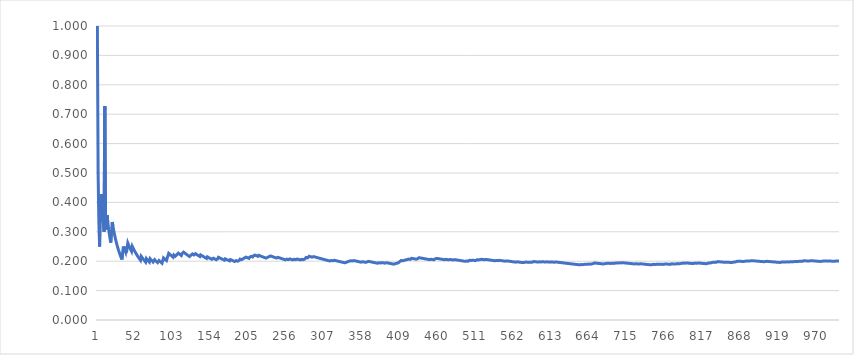
| Category | Series 0 |
|---|---|
| 0 | 1 |
| 1 | 0.5 |
| 2 | 0.333 |
| 3 | 0.25 |
| 4 | 0.4 |
| 5 | 0.333 |
| 6 | 0.429 |
| 7 | 0.375 |
| 8 | 0.333 |
| 9 | 0.3 |
| 10 | 0.727 |
| 11 | 0.333 |
| 12 | 0.308 |
| 13 | 0.357 |
| 14 | 0.333 |
| 15 | 0.312 |
| 16 | 0.294 |
| 17 | 0.278 |
| 18 | 0.263 |
| 19 | 0.3 |
| 20 | 0.333 |
| 21 | 0.318 |
| 22 | 0.304 |
| 23 | 0.292 |
| 24 | 0.28 |
| 25 | 0.269 |
| 26 | 0.259 |
| 27 | 0.25 |
| 28 | 0.241 |
| 29 | 0.233 |
| 30 | 0.226 |
| 31 | 0.219 |
| 32 | 0.212 |
| 33 | 0.206 |
| 34 | 0.229 |
| 35 | 0.25 |
| 36 | 0.243 |
| 37 | 0.237 |
| 38 | 0.231 |
| 39 | 0.25 |
| 40 | 0.244 |
| 41 | 0.262 |
| 42 | 0.256 |
| 43 | 0.25 |
| 44 | 0.244 |
| 45 | 0.239 |
| 46 | 0.234 |
| 47 | 0.25 |
| 48 | 0.245 |
| 49 | 0.24 |
| 50 | 0.235 |
| 51 | 0.231 |
| 52 | 0.226 |
| 53 | 0.222 |
| 54 | 0.218 |
| 55 | 0.214 |
| 56 | 0.211 |
| 57 | 0.207 |
| 58 | 0.203 |
| 59 | 0.217 |
| 60 | 0.213 |
| 61 | 0.21 |
| 62 | 0.206 |
| 63 | 0.203 |
| 64 | 0.2 |
| 65 | 0.197 |
| 66 | 0.209 |
| 67 | 0.206 |
| 68 | 0.203 |
| 69 | 0.2 |
| 70 | 0.197 |
| 71 | 0.208 |
| 72 | 0.205 |
| 73 | 0.203 |
| 74 | 0.2 |
| 75 | 0.197 |
| 76 | 0.195 |
| 77 | 0.205 |
| 78 | 0.203 |
| 79 | 0.2 |
| 80 | 0.198 |
| 81 | 0.195 |
| 82 | 0.193 |
| 83 | 0.202 |
| 84 | 0.2 |
| 85 | 0.198 |
| 86 | 0.195 |
| 87 | 0.193 |
| 88 | 0.202 |
| 89 | 0.211 |
| 90 | 0.209 |
| 91 | 0.207 |
| 92 | 0.204 |
| 93 | 0.202 |
| 94 | 0.211 |
| 95 | 0.219 |
| 96 | 0.227 |
| 97 | 0.224 |
| 98 | 0.222 |
| 99 | 0.22 |
| 100 | 0.218 |
| 101 | 0.216 |
| 102 | 0.214 |
| 103 | 0.221 |
| 104 | 0.219 |
| 105 | 0.217 |
| 106 | 0.215 |
| 107 | 0.222 |
| 108 | 0.22 |
| 109 | 0.227 |
| 110 | 0.225 |
| 111 | 0.223 |
| 112 | 0.221 |
| 113 | 0.219 |
| 114 | 0.226 |
| 115 | 0.224 |
| 116 | 0.231 |
| 117 | 0.229 |
| 118 | 0.227 |
| 119 | 0.225 |
| 120 | 0.223 |
| 121 | 0.221 |
| 122 | 0.22 |
| 123 | 0.218 |
| 124 | 0.216 |
| 125 | 0.214 |
| 126 | 0.22 |
| 127 | 0.219 |
| 128 | 0.225 |
| 129 | 0.223 |
| 130 | 0.221 |
| 131 | 0.22 |
| 132 | 0.226 |
| 133 | 0.224 |
| 134 | 0.222 |
| 135 | 0.221 |
| 136 | 0.219 |
| 137 | 0.217 |
| 138 | 0.216 |
| 139 | 0.221 |
| 140 | 0.22 |
| 141 | 0.218 |
| 142 | 0.217 |
| 143 | 0.215 |
| 144 | 0.214 |
| 145 | 0.212 |
| 146 | 0.211 |
| 147 | 0.209 |
| 148 | 0.215 |
| 149 | 0.213 |
| 150 | 0.212 |
| 151 | 0.211 |
| 152 | 0.209 |
| 153 | 0.208 |
| 154 | 0.206 |
| 155 | 0.205 |
| 156 | 0.21 |
| 157 | 0.209 |
| 158 | 0.208 |
| 159 | 0.206 |
| 160 | 0.205 |
| 161 | 0.204 |
| 162 | 0.209 |
| 163 | 0.213 |
| 164 | 0.212 |
| 165 | 0.211 |
| 166 | 0.21 |
| 167 | 0.208 |
| 168 | 0.207 |
| 169 | 0.206 |
| 170 | 0.205 |
| 171 | 0.203 |
| 172 | 0.208 |
| 173 | 0.207 |
| 174 | 0.206 |
| 175 | 0.205 |
| 176 | 0.203 |
| 177 | 0.202 |
| 178 | 0.201 |
| 179 | 0.206 |
| 180 | 0.204 |
| 181 | 0.203 |
| 182 | 0.202 |
| 183 | 0.201 |
| 184 | 0.2 |
| 185 | 0.199 |
| 186 | 0.198 |
| 187 | 0.202 |
| 188 | 0.201 |
| 189 | 0.2 |
| 190 | 0.199 |
| 191 | 0.203 |
| 192 | 0.207 |
| 193 | 0.206 |
| 194 | 0.205 |
| 195 | 0.204 |
| 196 | 0.208 |
| 197 | 0.207 |
| 198 | 0.211 |
| 199 | 0.21 |
| 200 | 0.214 |
| 201 | 0.213 |
| 202 | 0.212 |
| 203 | 0.211 |
| 204 | 0.21 |
| 205 | 0.214 |
| 206 | 0.213 |
| 207 | 0.216 |
| 208 | 0.215 |
| 209 | 0.214 |
| 210 | 0.218 |
| 211 | 0.217 |
| 212 | 0.221 |
| 213 | 0.22 |
| 214 | 0.219 |
| 215 | 0.218 |
| 216 | 0.217 |
| 217 | 0.22 |
| 218 | 0.219 |
| 219 | 0.218 |
| 220 | 0.217 |
| 221 | 0.216 |
| 222 | 0.215 |
| 223 | 0.214 |
| 224 | 0.213 |
| 225 | 0.212 |
| 226 | 0.211 |
| 227 | 0.211 |
| 228 | 0.21 |
| 229 | 0.213 |
| 230 | 0.212 |
| 231 | 0.216 |
| 232 | 0.215 |
| 233 | 0.218 |
| 234 | 0.217 |
| 235 | 0.216 |
| 236 | 0.215 |
| 237 | 0.214 |
| 238 | 0.213 |
| 239 | 0.212 |
| 240 | 0.212 |
| 241 | 0.211 |
| 242 | 0.214 |
| 243 | 0.213 |
| 244 | 0.212 |
| 245 | 0.211 |
| 246 | 0.211 |
| 247 | 0.21 |
| 248 | 0.209 |
| 249 | 0.208 |
| 250 | 0.207 |
| 251 | 0.206 |
| 252 | 0.206 |
| 253 | 0.205 |
| 254 | 0.204 |
| 255 | 0.207 |
| 256 | 0.206 |
| 257 | 0.205 |
| 258 | 0.208 |
| 259 | 0.208 |
| 260 | 0.207 |
| 261 | 0.206 |
| 262 | 0.205 |
| 263 | 0.205 |
| 264 | 0.204 |
| 265 | 0.207 |
| 266 | 0.206 |
| 267 | 0.205 |
| 268 | 0.208 |
| 269 | 0.207 |
| 270 | 0.207 |
| 271 | 0.206 |
| 272 | 0.205 |
| 273 | 0.204 |
| 274 | 0.207 |
| 275 | 0.207 |
| 276 | 0.206 |
| 277 | 0.205 |
| 278 | 0.204 |
| 279 | 0.207 |
| 280 | 0.21 |
| 281 | 0.213 |
| 282 | 0.212 |
| 283 | 0.211 |
| 284 | 0.214 |
| 285 | 0.217 |
| 286 | 0.216 |
| 287 | 0.215 |
| 288 | 0.215 |
| 289 | 0.214 |
| 290 | 0.213 |
| 291 | 0.216 |
| 292 | 0.215 |
| 293 | 0.214 |
| 294 | 0.214 |
| 295 | 0.213 |
| 296 | 0.212 |
| 297 | 0.211 |
| 298 | 0.211 |
| 299 | 0.21 |
| 300 | 0.209 |
| 301 | 0.209 |
| 302 | 0.208 |
| 303 | 0.207 |
| 304 | 0.207 |
| 305 | 0.206 |
| 306 | 0.205 |
| 307 | 0.205 |
| 308 | 0.204 |
| 309 | 0.203 |
| 310 | 0.203 |
| 311 | 0.202 |
| 312 | 0.201 |
| 313 | 0.201 |
| 314 | 0.2 |
| 315 | 0.203 |
| 316 | 0.202 |
| 317 | 0.201 |
| 318 | 0.204 |
| 319 | 0.203 |
| 320 | 0.202 |
| 321 | 0.202 |
| 322 | 0.201 |
| 323 | 0.201 |
| 324 | 0.2 |
| 325 | 0.199 |
| 326 | 0.199 |
| 327 | 0.198 |
| 328 | 0.198 |
| 329 | 0.197 |
| 330 | 0.196 |
| 331 | 0.196 |
| 332 | 0.195 |
| 333 | 0.195 |
| 334 | 0.197 |
| 335 | 0.196 |
| 336 | 0.199 |
| 337 | 0.198 |
| 338 | 0.201 |
| 339 | 0.2 |
| 340 | 0.199 |
| 341 | 0.202 |
| 342 | 0.201 |
| 343 | 0.201 |
| 344 | 0.203 |
| 345 | 0.202 |
| 346 | 0.202 |
| 347 | 0.201 |
| 348 | 0.201 |
| 349 | 0.2 |
| 350 | 0.199 |
| 351 | 0.199 |
| 352 | 0.198 |
| 353 | 0.198 |
| 354 | 0.197 |
| 355 | 0.197 |
| 356 | 0.199 |
| 357 | 0.198 |
| 358 | 0.198 |
| 359 | 0.197 |
| 360 | 0.197 |
| 361 | 0.196 |
| 362 | 0.198 |
| 363 | 0.198 |
| 364 | 0.197 |
| 365 | 0.199 |
| 366 | 0.199 |
| 367 | 0.198 |
| 368 | 0.198 |
| 369 | 0.197 |
| 370 | 0.197 |
| 371 | 0.196 |
| 372 | 0.196 |
| 373 | 0.195 |
| 374 | 0.195 |
| 375 | 0.194 |
| 376 | 0.194 |
| 377 | 0.193 |
| 378 | 0.193 |
| 379 | 0.195 |
| 380 | 0.194 |
| 381 | 0.194 |
| 382 | 0.196 |
| 383 | 0.195 |
| 384 | 0.195 |
| 385 | 0.194 |
| 386 | 0.194 |
| 387 | 0.193 |
| 388 | 0.193 |
| 389 | 0.195 |
| 390 | 0.194 |
| 391 | 0.194 |
| 392 | 0.193 |
| 393 | 0.193 |
| 394 | 0.192 |
| 395 | 0.192 |
| 396 | 0.191 |
| 397 | 0.191 |
| 398 | 0.19 |
| 399 | 0.19 |
| 400 | 0.192 |
| 401 | 0.192 |
| 402 | 0.191 |
| 403 | 0.193 |
| 404 | 0.193 |
| 405 | 0.195 |
| 406 | 0.197 |
| 407 | 0.199 |
| 408 | 0.2 |
| 409 | 0.202 |
| 410 | 0.202 |
| 411 | 0.201 |
| 412 | 0.201 |
| 413 | 0.203 |
| 414 | 0.202 |
| 415 | 0.204 |
| 416 | 0.206 |
| 417 | 0.206 |
| 418 | 0.205 |
| 419 | 0.207 |
| 420 | 0.207 |
| 421 | 0.206 |
| 422 | 0.208 |
| 423 | 0.21 |
| 424 | 0.209 |
| 425 | 0.209 |
| 426 | 0.208 |
| 427 | 0.208 |
| 428 | 0.207 |
| 429 | 0.207 |
| 430 | 0.206 |
| 431 | 0.208 |
| 432 | 0.21 |
| 433 | 0.212 |
| 434 | 0.211 |
| 435 | 0.211 |
| 436 | 0.211 |
| 437 | 0.21 |
| 438 | 0.21 |
| 439 | 0.209 |
| 440 | 0.209 |
| 441 | 0.208 |
| 442 | 0.208 |
| 443 | 0.207 |
| 444 | 0.207 |
| 445 | 0.206 |
| 446 | 0.206 |
| 447 | 0.205 |
| 448 | 0.205 |
| 449 | 0.207 |
| 450 | 0.206 |
| 451 | 0.206 |
| 452 | 0.205 |
| 453 | 0.205 |
| 454 | 0.207 |
| 455 | 0.208 |
| 456 | 0.21 |
| 457 | 0.21 |
| 458 | 0.209 |
| 459 | 0.209 |
| 460 | 0.208 |
| 461 | 0.208 |
| 462 | 0.207 |
| 463 | 0.207 |
| 464 | 0.206 |
| 465 | 0.206 |
| 466 | 0.206 |
| 467 | 0.205 |
| 468 | 0.207 |
| 469 | 0.206 |
| 470 | 0.206 |
| 471 | 0.206 |
| 472 | 0.205 |
| 473 | 0.205 |
| 474 | 0.204 |
| 475 | 0.206 |
| 476 | 0.205 |
| 477 | 0.205 |
| 478 | 0.205 |
| 479 | 0.204 |
| 480 | 0.204 |
| 481 | 0.205 |
| 482 | 0.205 |
| 483 | 0.205 |
| 484 | 0.204 |
| 485 | 0.204 |
| 486 | 0.203 |
| 487 | 0.203 |
| 488 | 0.202 |
| 489 | 0.202 |
| 490 | 0.202 |
| 491 | 0.201 |
| 492 | 0.201 |
| 493 | 0.2 |
| 494 | 0.2 |
| 495 | 0.2 |
| 496 | 0.201 |
| 497 | 0.201 |
| 498 | 0.2 |
| 499 | 0.2 |
| 500 | 0.202 |
| 501 | 0.203 |
| 502 | 0.203 |
| 503 | 0.202 |
| 504 | 0.202 |
| 505 | 0.204 |
| 506 | 0.203 |
| 507 | 0.203 |
| 508 | 0.202 |
| 509 | 0.202 |
| 510 | 0.204 |
| 511 | 0.205 |
| 512 | 0.205 |
| 513 | 0.204 |
| 514 | 0.206 |
| 515 | 0.205 |
| 516 | 0.207 |
| 517 | 0.207 |
| 518 | 0.206 |
| 519 | 0.206 |
| 520 | 0.205 |
| 521 | 0.205 |
| 522 | 0.205 |
| 523 | 0.206 |
| 524 | 0.206 |
| 525 | 0.205 |
| 526 | 0.205 |
| 527 | 0.205 |
| 528 | 0.204 |
| 529 | 0.204 |
| 530 | 0.203 |
| 531 | 0.203 |
| 532 | 0.203 |
| 533 | 0.202 |
| 534 | 0.202 |
| 535 | 0.201 |
| 536 | 0.201 |
| 537 | 0.203 |
| 538 | 0.202 |
| 539 | 0.202 |
| 540 | 0.203 |
| 541 | 0.203 |
| 542 | 0.203 |
| 543 | 0.202 |
| 544 | 0.202 |
| 545 | 0.201 |
| 546 | 0.201 |
| 547 | 0.201 |
| 548 | 0.2 |
| 549 | 0.2 |
| 550 | 0.2 |
| 551 | 0.201 |
| 552 | 0.201 |
| 553 | 0.2 |
| 554 | 0.2 |
| 555 | 0.2 |
| 556 | 0.199 |
| 557 | 0.199 |
| 558 | 0.199 |
| 559 | 0.198 |
| 560 | 0.198 |
| 561 | 0.198 |
| 562 | 0.197 |
| 563 | 0.197 |
| 564 | 0.196 |
| 565 | 0.198 |
| 566 | 0.198 |
| 567 | 0.197 |
| 568 | 0.197 |
| 569 | 0.196 |
| 570 | 0.196 |
| 571 | 0.196 |
| 572 | 0.195 |
| 573 | 0.195 |
| 574 | 0.195 |
| 575 | 0.196 |
| 576 | 0.198 |
| 577 | 0.197 |
| 578 | 0.197 |
| 579 | 0.197 |
| 580 | 0.196 |
| 581 | 0.196 |
| 582 | 0.196 |
| 583 | 0.197 |
| 584 | 0.197 |
| 585 | 0.196 |
| 586 | 0.198 |
| 587 | 0.199 |
| 588 | 0.199 |
| 589 | 0.198 |
| 590 | 0.198 |
| 591 | 0.198 |
| 592 | 0.197 |
| 593 | 0.197 |
| 594 | 0.197 |
| 595 | 0.198 |
| 596 | 0.198 |
| 597 | 0.197 |
| 598 | 0.199 |
| 599 | 0.198 |
| 600 | 0.198 |
| 601 | 0.198 |
| 602 | 0.197 |
| 603 | 0.197 |
| 604 | 0.197 |
| 605 | 0.198 |
| 606 | 0.198 |
| 607 | 0.197 |
| 608 | 0.197 |
| 609 | 0.197 |
| 610 | 0.198 |
| 611 | 0.198 |
| 612 | 0.197 |
| 613 | 0.197 |
| 614 | 0.197 |
| 615 | 0.196 |
| 616 | 0.196 |
| 617 | 0.197 |
| 618 | 0.197 |
| 619 | 0.197 |
| 620 | 0.196 |
| 621 | 0.196 |
| 622 | 0.196 |
| 623 | 0.196 |
| 624 | 0.195 |
| 625 | 0.195 |
| 626 | 0.195 |
| 627 | 0.194 |
| 628 | 0.194 |
| 629 | 0.194 |
| 630 | 0.193 |
| 631 | 0.193 |
| 632 | 0.193 |
| 633 | 0.192 |
| 634 | 0.192 |
| 635 | 0.192 |
| 636 | 0.192 |
| 637 | 0.191 |
| 638 | 0.191 |
| 639 | 0.191 |
| 640 | 0.19 |
| 641 | 0.19 |
| 642 | 0.19 |
| 643 | 0.189 |
| 644 | 0.189 |
| 645 | 0.189 |
| 646 | 0.189 |
| 647 | 0.188 |
| 648 | 0.188 |
| 649 | 0.188 |
| 650 | 0.187 |
| 651 | 0.189 |
| 652 | 0.188 |
| 653 | 0.188 |
| 654 | 0.188 |
| 655 | 0.189 |
| 656 | 0.189 |
| 657 | 0.19 |
| 658 | 0.19 |
| 659 | 0.189 |
| 660 | 0.191 |
| 661 | 0.19 |
| 662 | 0.19 |
| 663 | 0.19 |
| 664 | 0.189 |
| 665 | 0.191 |
| 666 | 0.19 |
| 667 | 0.192 |
| 668 | 0.193 |
| 669 | 0.194 |
| 670 | 0.194 |
| 671 | 0.193 |
| 672 | 0.193 |
| 673 | 0.193 |
| 674 | 0.193 |
| 675 | 0.192 |
| 676 | 0.192 |
| 677 | 0.192 |
| 678 | 0.191 |
| 679 | 0.191 |
| 680 | 0.191 |
| 681 | 0.191 |
| 682 | 0.19 |
| 683 | 0.192 |
| 684 | 0.193 |
| 685 | 0.192 |
| 686 | 0.192 |
| 687 | 0.193 |
| 688 | 0.193 |
| 689 | 0.193 |
| 690 | 0.192 |
| 691 | 0.192 |
| 692 | 0.193 |
| 693 | 0.193 |
| 694 | 0.193 |
| 695 | 0.193 |
| 696 | 0.194 |
| 697 | 0.193 |
| 698 | 0.195 |
| 699 | 0.194 |
| 700 | 0.194 |
| 701 | 0.194 |
| 702 | 0.193 |
| 703 | 0.195 |
| 704 | 0.194 |
| 705 | 0.194 |
| 706 | 0.195 |
| 707 | 0.195 |
| 708 | 0.195 |
| 709 | 0.194 |
| 710 | 0.194 |
| 711 | 0.194 |
| 712 | 0.194 |
| 713 | 0.193 |
| 714 | 0.193 |
| 715 | 0.193 |
| 716 | 0.192 |
| 717 | 0.192 |
| 718 | 0.192 |
| 719 | 0.192 |
| 720 | 0.191 |
| 721 | 0.191 |
| 722 | 0.191 |
| 723 | 0.191 |
| 724 | 0.192 |
| 725 | 0.191 |
| 726 | 0.191 |
| 727 | 0.191 |
| 728 | 0.191 |
| 729 | 0.19 |
| 730 | 0.192 |
| 731 | 0.191 |
| 732 | 0.191 |
| 733 | 0.191 |
| 734 | 0.19 |
| 735 | 0.19 |
| 736 | 0.19 |
| 737 | 0.19 |
| 738 | 0.189 |
| 739 | 0.189 |
| 740 | 0.189 |
| 741 | 0.189 |
| 742 | 0.188 |
| 743 | 0.188 |
| 744 | 0.188 |
| 745 | 0.188 |
| 746 | 0.187 |
| 747 | 0.189 |
| 748 | 0.188 |
| 749 | 0.189 |
| 750 | 0.189 |
| 751 | 0.189 |
| 752 | 0.189 |
| 753 | 0.19 |
| 754 | 0.189 |
| 755 | 0.189 |
| 756 | 0.189 |
| 757 | 0.19 |
| 758 | 0.19 |
| 759 | 0.189 |
| 760 | 0.189 |
| 761 | 0.189 |
| 762 | 0.19 |
| 763 | 0.19 |
| 764 | 0.19 |
| 765 | 0.191 |
| 766 | 0.19 |
| 767 | 0.19 |
| 768 | 0.19 |
| 769 | 0.19 |
| 770 | 0.189 |
| 771 | 0.189 |
| 772 | 0.19 |
| 773 | 0.191 |
| 774 | 0.191 |
| 775 | 0.191 |
| 776 | 0.19 |
| 777 | 0.19 |
| 778 | 0.19 |
| 779 | 0.191 |
| 780 | 0.191 |
| 781 | 0.192 |
| 782 | 0.192 |
| 783 | 0.191 |
| 784 | 0.192 |
| 785 | 0.192 |
| 786 | 0.193 |
| 787 | 0.193 |
| 788 | 0.194 |
| 789 | 0.194 |
| 790 | 0.193 |
| 791 | 0.193 |
| 792 | 0.193 |
| 793 | 0.194 |
| 794 | 0.194 |
| 795 | 0.193 |
| 796 | 0.193 |
| 797 | 0.193 |
| 798 | 0.193 |
| 799 | 0.192 |
| 800 | 0.192 |
| 801 | 0.192 |
| 802 | 0.193 |
| 803 | 0.193 |
| 804 | 0.193 |
| 805 | 0.194 |
| 806 | 0.193 |
| 807 | 0.193 |
| 808 | 0.193 |
| 809 | 0.194 |
| 810 | 0.194 |
| 811 | 0.193 |
| 812 | 0.193 |
| 813 | 0.193 |
| 814 | 0.193 |
| 815 | 0.192 |
| 816 | 0.192 |
| 817 | 0.192 |
| 818 | 0.192 |
| 819 | 0.191 |
| 820 | 0.191 |
| 821 | 0.192 |
| 822 | 0.193 |
| 823 | 0.194 |
| 824 | 0.194 |
| 825 | 0.194 |
| 826 | 0.195 |
| 827 | 0.196 |
| 828 | 0.197 |
| 829 | 0.196 |
| 830 | 0.196 |
| 831 | 0.196 |
| 832 | 0.197 |
| 833 | 0.197 |
| 834 | 0.198 |
| 835 | 0.199 |
| 836 | 0.198 |
| 837 | 0.198 |
| 838 | 0.198 |
| 839 | 0.198 |
| 840 | 0.197 |
| 841 | 0.197 |
| 842 | 0.197 |
| 843 | 0.197 |
| 844 | 0.196 |
| 845 | 0.196 |
| 846 | 0.197 |
| 847 | 0.197 |
| 848 | 0.197 |
| 849 | 0.196 |
| 850 | 0.196 |
| 851 | 0.196 |
| 852 | 0.196 |
| 853 | 0.196 |
| 854 | 0.195 |
| 855 | 0.196 |
| 856 | 0.196 |
| 857 | 0.197 |
| 858 | 0.197 |
| 859 | 0.198 |
| 860 | 0.199 |
| 861 | 0.2 |
| 862 | 0.199 |
| 863 | 0.2 |
| 864 | 0.2 |
| 865 | 0.2 |
| 866 | 0.2 |
| 867 | 0.199 |
| 868 | 0.199 |
| 869 | 0.199 |
| 870 | 0.199 |
| 871 | 0.2 |
| 872 | 0.199 |
| 873 | 0.2 |
| 874 | 0.201 |
| 875 | 0.201 |
| 876 | 0.201 |
| 877 | 0.2 |
| 878 | 0.201 |
| 879 | 0.201 |
| 880 | 0.202 |
| 881 | 0.202 |
| 882 | 0.202 |
| 883 | 0.201 |
| 884 | 0.201 |
| 885 | 0.201 |
| 886 | 0.201 |
| 887 | 0.2 |
| 888 | 0.2 |
| 889 | 0.2 |
| 890 | 0.2 |
| 891 | 0.2 |
| 892 | 0.199 |
| 893 | 0.199 |
| 894 | 0.199 |
| 895 | 0.199 |
| 896 | 0.198 |
| 897 | 0.198 |
| 898 | 0.198 |
| 899 | 0.199 |
| 900 | 0.199 |
| 901 | 0.2 |
| 902 | 0.199 |
| 903 | 0.199 |
| 904 | 0.199 |
| 905 | 0.199 |
| 906 | 0.198 |
| 907 | 0.198 |
| 908 | 0.198 |
| 909 | 0.198 |
| 910 | 0.198 |
| 911 | 0.197 |
| 912 | 0.197 |
| 913 | 0.197 |
| 914 | 0.197 |
| 915 | 0.197 |
| 916 | 0.196 |
| 917 | 0.196 |
| 918 | 0.196 |
| 919 | 0.196 |
| 920 | 0.197 |
| 921 | 0.197 |
| 922 | 0.197 |
| 923 | 0.197 |
| 924 | 0.197 |
| 925 | 0.198 |
| 926 | 0.197 |
| 927 | 0.197 |
| 928 | 0.197 |
| 929 | 0.198 |
| 930 | 0.198 |
| 931 | 0.197 |
| 932 | 0.197 |
| 933 | 0.198 |
| 934 | 0.198 |
| 935 | 0.198 |
| 936 | 0.199 |
| 937 | 0.198 |
| 938 | 0.199 |
| 939 | 0.199 |
| 940 | 0.199 |
| 941 | 0.199 |
| 942 | 0.198 |
| 943 | 0.199 |
| 944 | 0.2 |
| 945 | 0.2 |
| 946 | 0.2 |
| 947 | 0.199 |
| 948 | 0.199 |
| 949 | 0.2 |
| 950 | 0.201 |
| 951 | 0.202 |
| 952 | 0.201 |
| 953 | 0.201 |
| 954 | 0.201 |
| 955 | 0.201 |
| 956 | 0.201 |
| 957 | 0.2 |
| 958 | 0.2 |
| 959 | 0.201 |
| 960 | 0.201 |
| 961 | 0.202 |
| 962 | 0.201 |
| 963 | 0.201 |
| 964 | 0.201 |
| 965 | 0.201 |
| 966 | 0.201 |
| 967 | 0.2 |
| 968 | 0.2 |
| 969 | 0.2 |
| 970 | 0.2 |
| 971 | 0.2 |
| 972 | 0.199 |
| 973 | 0.199 |
| 974 | 0.2 |
| 975 | 0.2 |
| 976 | 0.2 |
| 977 | 0.2 |
| 978 | 0.2 |
| 979 | 0.201 |
| 980 | 0.201 |
| 981 | 0.201 |
| 982 | 0.2 |
| 983 | 0.2 |
| 984 | 0.2 |
| 985 | 0.201 |
| 986 | 0.201 |
| 987 | 0.2 |
| 988 | 0.2 |
| 989 | 0.2 |
| 990 | 0.2 |
| 991 | 0.2 |
| 992 | 0.199 |
| 993 | 0.2 |
| 994 | 0.201 |
| 995 | 0.201 |
| 996 | 0.201 |
| 997 | 0.2 |
| 998 | 0.201 |
| 999 | 0.201 |